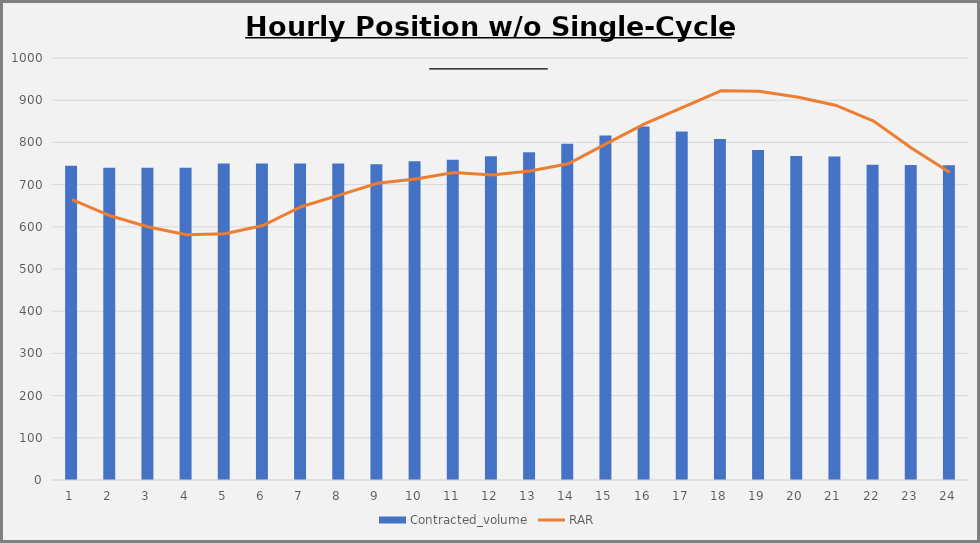
| Category | Contracted_volume |
|---|---|
| 0 | 744.636 |
| 1 | 740.086 |
| 2 | 739.847 |
| 3 | 739.652 |
| 4 | 750.195 |
| 5 | 749.992 |
| 6 | 749.814 |
| 7 | 749.773 |
| 8 | 747.975 |
| 9 | 755.56 |
| 10 | 758.785 |
| 11 | 766.966 |
| 12 | 776.51 |
| 13 | 796.564 |
| 14 | 816.27 |
| 15 | 837.617 |
| 16 | 825.892 |
| 17 | 808.302 |
| 18 | 782.004 |
| 19 | 767.755 |
| 20 | 766.544 |
| 21 | 746.748 |
| 22 | 746.439 |
| 23 | 746.106 |